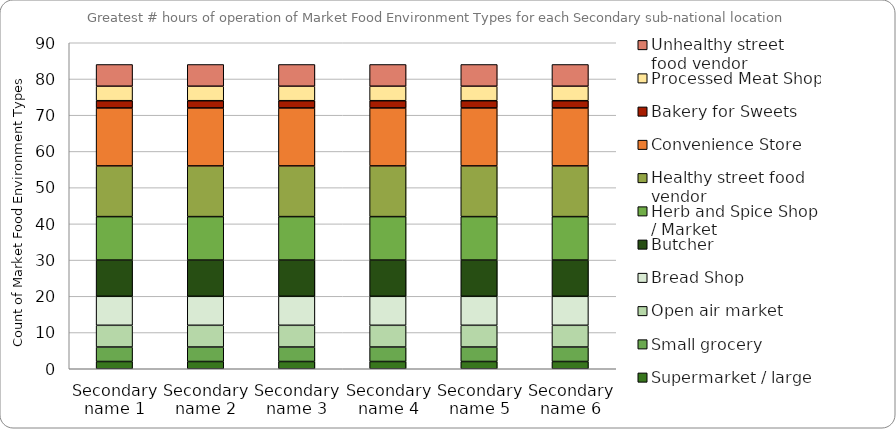
| Category | Supermarket / large grocery | Small grocery | Open air market | Bread Shop | Butcher | Herb and Spice Shop / Market | Healthy street food vendor | Convenience Store | Bakery for Sweets | Processed Meat Shop | Unhealthy street food vendor |
|---|---|---|---|---|---|---|---|---|---|---|---|
| Secondary name 1 | 2 | 4 | 6 | 8 | 10 | 12 | 14 | 16 | 2 | 4 | 6 |
| Secondary name 2 | 2 | 4 | 6 | 8 | 10 | 12 | 14 | 16 | 2 | 4 | 6 |
| Secondary name 3 | 2 | 4 | 6 | 8 | 10 | 12 | 14 | 16 | 2 | 4 | 6 |
| Secondary name 4 | 2 | 4 | 6 | 8 | 10 | 12 | 14 | 16 | 2 | 4 | 6 |
| Secondary name 5 | 2 | 4 | 6 | 8 | 10 | 12 | 14 | 16 | 2 | 4 | 6 |
| Secondary name 6 | 2 | 4 | 6 | 8 | 10 | 12 | 14 | 16 | 2 | 4 | 6 |